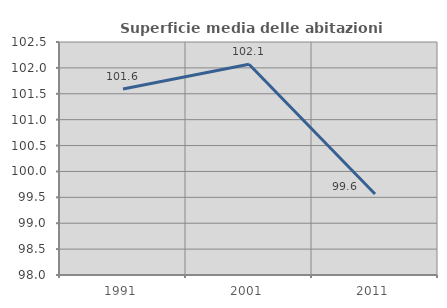
| Category | Superficie media delle abitazioni occupate |
|---|---|
| 1991.0 | 101.59 |
| 2001.0 | 102.069 |
| 2011.0 | 99.564 |